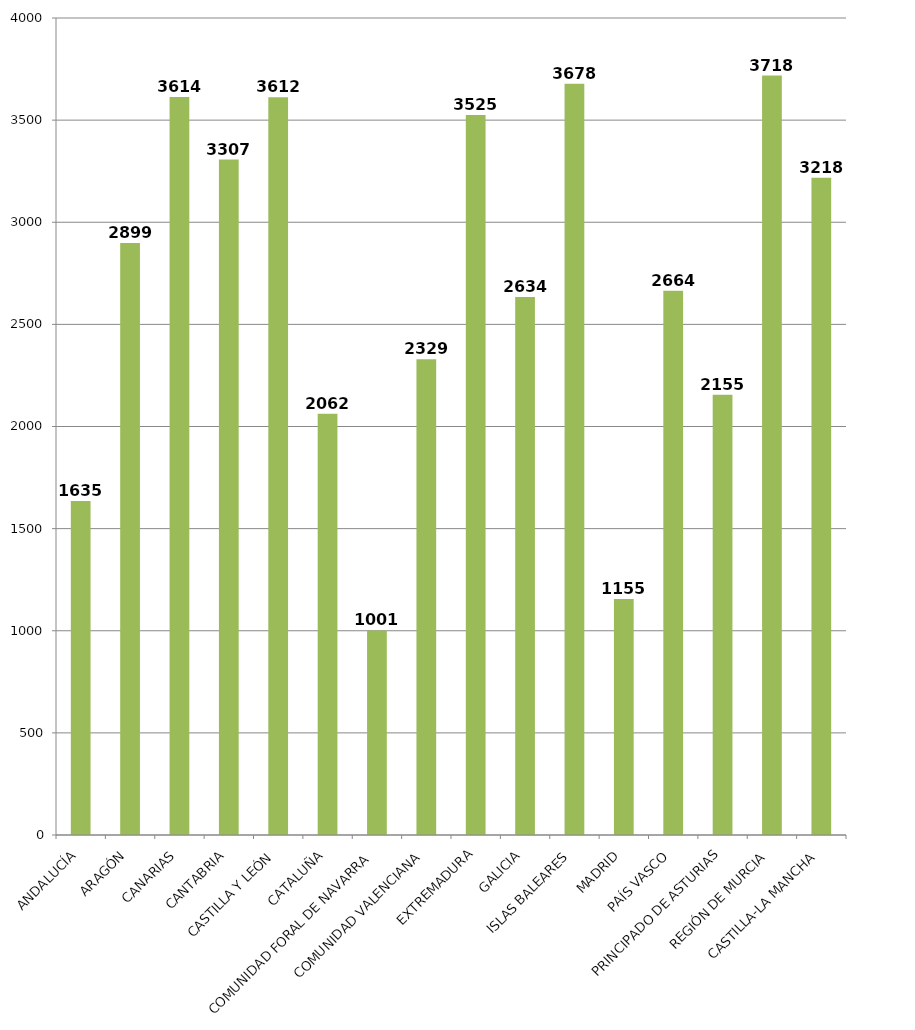
| Category | Total |
|---|---|
| ANDALUCÍA | 1635.2 |
| ARAGÓN | 2899 |
| CANARIAS | 3613.5 |
| CANTABRIA | 3307 |
| CASTILLA Y LEÓN | 3612.4 |
| CATALUÑA | 2062.381 |
| COMUNIDAD FORAL DE NAVARRA | 1001.333 |
| COMUNIDAD VALENCIANA | 2329.2 |
| EXTREMADURA | 3524.5 |
| GALICIA | 2633.8 |
| ISLAS BALEARES | 3678 |
| MADRID | 1155.455 |
| PAÍS VASCO | 2664.4 |
| PRINCIPADO DE ASTURIAS | 2155 |
| REGIÓN DE MURCIA | 3718 |
| CASTILLA-LA MANCHA | 3217.5 |